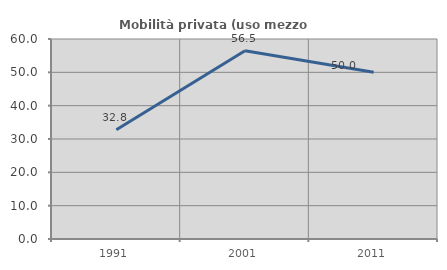
| Category | Mobilità privata (uso mezzo privato) |
|---|---|
| 1991.0 | 32.782 |
| 2001.0 | 56.504 |
| 2011.0 | 50 |